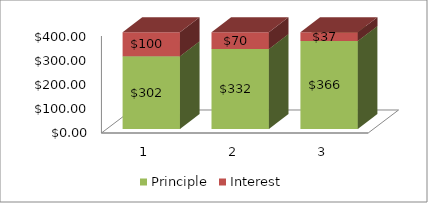
| Category | Principle | Interest |
|---|---|---|
| 0 | 302.115 | 100 |
| 1 | 332.326 | 69.789 |
| 2 | 365.559 | 36.556 |